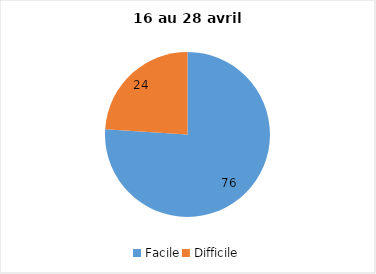
| Category | Series 0 |
|---|---|
| Facile | 76 |
| Difficile | 24 |